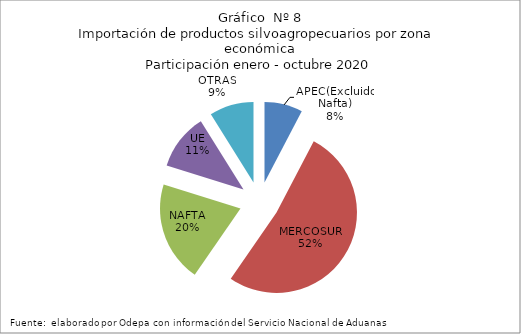
| Category | Series 0 |
|---|---|
| APEC(Excluido Nafta) | 408014.759 |
| MERCOSUR | 2769451.157 |
| NAFTA | 1076537.837 |
| UE | 601501.708 |
| OTRAS | 473683.539 |